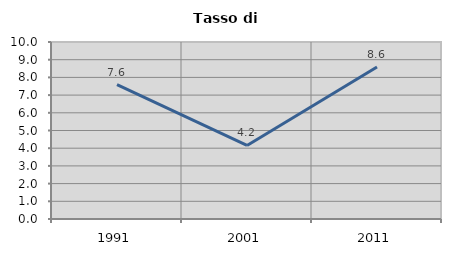
| Category | Tasso di disoccupazione   |
|---|---|
| 1991.0 | 7.598 |
| 2001.0 | 4.157 |
| 2011.0 | 8.588 |